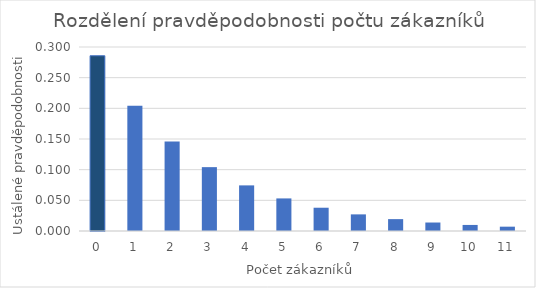
| Category | Series 0 |
|---|---|
| 0.0 | 0.286 |
| 1.0 | 0.204 |
| 2.0 | 0.146 |
| 3.0 | 0.104 |
| 4.0 | 0.074 |
| 5.0 | 0.053 |
| 6.0 | 0.038 |
| 7.0 | 0.027 |
| 8.0 | 0.019 |
| 9.0 | 0.014 |
| 10.0 | 0.01 |
| 11.0 | 0.007 |